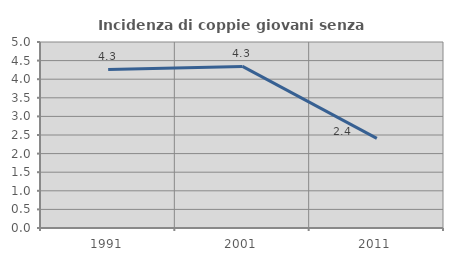
| Category | Incidenza di coppie giovani senza figli |
|---|---|
| 1991.0 | 4.261 |
| 2001.0 | 4.343 |
| 2011.0 | 2.409 |